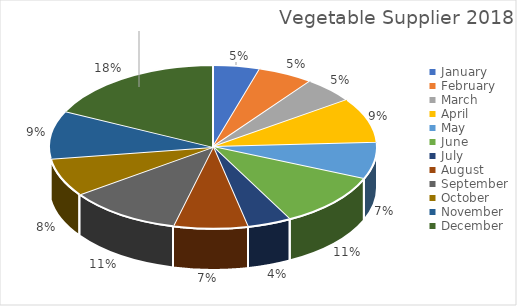
| Category | Series 0 |
|---|---|
| January | 0.046 |
| February | 0.055 |
| March | 0.051 |
| April | 0.09 |
| May | 0.072 |
| June | 0.108 |
| July | 0.043 |
| August | 0.073 |
| September | 0.112 |
| October | 0.076 |
| November | 0.095 |
| December | 0.178 |